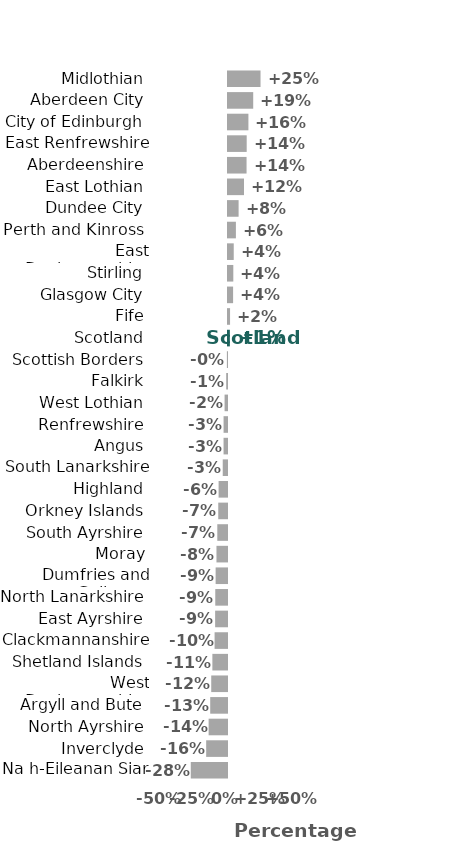
| Category | Series 0 |
|---|---|
| Na h-Eileanan Siar | -27.872 |
| Inverclyde | -16.024 |
| North Ayrshire | -14.134 |
| Argyll and Bute | -12.906 |
| West Dunbartonshire | -12.129 |
| Shetland Islands | -11.261 |
| Clackmannanshire | -9.552 |
| East Ayrshire | -9.136 |
| North Lanarkshire | -9.027 |
| Dumfries and Galloway | -8.752 |
| Moray | -8.107 |
| South Ayrshire | -7.475 |
| Orkney Islands | -6.727 |
| Highland | -6.472 |
| South Lanarkshire | -3.289 |
| Angus | -2.653 |
| Renfrewshire | -2.642 |
| West Lothian | -1.87 |
| Falkirk | -0.622 |
| Scottish Borders | -0.084 |
| Scotland | 1.437 |
| Fife | 1.59 |
| Glasgow City | 3.928 |
| Stirling | 4.09 |
| East Dunbartonshire | 4.406 |
| Perth and Kinross | 6.075 |
| Dundee City | 8.151 |
| East Lothian | 12.309 |
| Aberdeenshire | 14.274 |
| East Renfrewshire | 14.374 |
| City of Edinburgh | 15.706 |
| Aberdeen City | 19.4 |
| Midlothian | 25.023 |